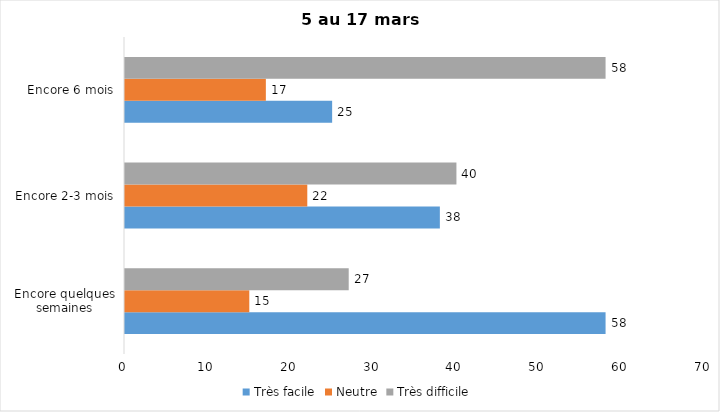
| Category | Très facile | Neutre | Très difficile |
|---|---|---|---|
| Encore quelques semaines | 58 | 15 | 27 |
| Encore 2-3 mois | 38 | 22 | 40 |
| Encore 6 mois | 25 | 17 | 58 |